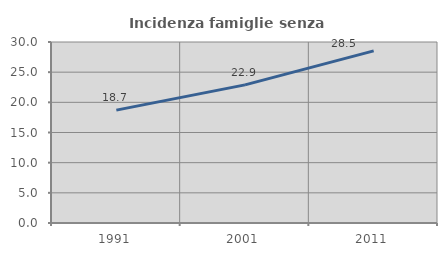
| Category | Incidenza famiglie senza nuclei |
|---|---|
| 1991.0 | 18.709 |
| 2001.0 | 22.893 |
| 2011.0 | 28.532 |